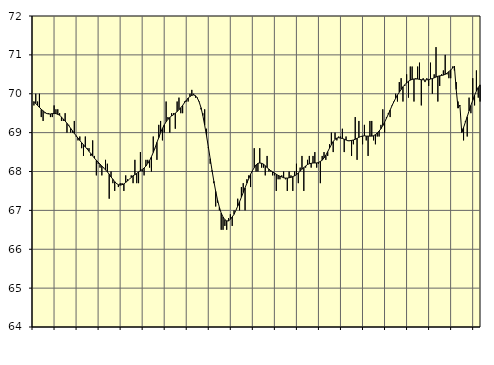
| Category | Piggar | Series 1 |
|---|---|---|
| nan | 69.7 | 69.8 |
| 1.0 | 70 | 69.75 |
| 1.0 | 69.8 | 69.7 |
| 1.0 | 70 | 69.65 |
| 1.0 | 69.4 | 69.6 |
| 1.0 | 69.3 | 69.56 |
| 1.0 | 69.5 | 69.52 |
| 1.0 | 69.5 | 69.49 |
| 1.0 | 69.5 | 69.48 |
| 1.0 | 69.4 | 69.48 |
| 1.0 | 69.4 | 69.49 |
| 1.0 | 69.7 | 69.49 |
| nan | 69.6 | 69.49 |
| 2.0 | 69.6 | 69.47 |
| 2.0 | 69.5 | 69.45 |
| 2.0 | 69.3 | 69.4 |
| 2.0 | 69.3 | 69.35 |
| 2.0 | 69.5 | 69.3 |
| 2.0 | 69 | 69.24 |
| 2.0 | 69.2 | 69.18 |
| 2.0 | 69 | 69.11 |
| 2.0 | 69 | 69.05 |
| 2.0 | 69.3 | 68.98 |
| 2.0 | 68.9 | 68.92 |
| nan | 68.8 | 68.86 |
| 3.0 | 68.9 | 68.8 |
| 3.0 | 68.6 | 68.74 |
| 3.0 | 68.4 | 68.69 |
| 3.0 | 68.9 | 68.63 |
| 3.0 | 68.6 | 68.58 |
| 3.0 | 68.6 | 68.52 |
| 3.0 | 68.4 | 68.46 |
| 3.0 | 68.8 | 68.4 |
| 3.0 | 68.4 | 68.34 |
| 3.0 | 67.9 | 68.29 |
| 3.0 | 68.2 | 68.24 |
| nan | 68.1 | 68.19 |
| 4.0 | 67.9 | 68.14 |
| 4.0 | 68.1 | 68.09 |
| 4.0 | 68.3 | 68.04 |
| 4.0 | 68.2 | 67.99 |
| 4.0 | 67.3 | 67.93 |
| 4.0 | 68 | 67.86 |
| 4.0 | 67.7 | 67.8 |
| 4.0 | 67.5 | 67.74 |
| 4.0 | 67.7 | 67.69 |
| 4.0 | 67.6 | 67.66 |
| 4.0 | 67.7 | 67.65 |
| nan | 67.7 | 67.66 |
| 5.0 | 67.5 | 67.68 |
| 5.0 | 67.9 | 67.72 |
| 5.0 | 67.8 | 67.76 |
| 5.0 | 67.8 | 67.8 |
| 5.0 | 67.9 | 67.85 |
| 5.0 | 67.7 | 67.89 |
| 5.0 | 68.3 | 67.92 |
| 5.0 | 67.7 | 67.95 |
| 5.0 | 67.7 | 67.99 |
| 5.0 | 68.5 | 68.02 |
| 5.0 | 68 | 68.05 |
| nan | 67.9 | 68.09 |
| 6.0 | 68.3 | 68.14 |
| 6.0 | 68.3 | 68.21 |
| 6.0 | 68.1 | 68.28 |
| 6.0 | 68 | 68.38 |
| 6.0 | 68.9 | 68.49 |
| 6.0 | 68.6 | 68.61 |
| 6.0 | 68.3 | 68.75 |
| 6.0 | 69.2 | 68.87 |
| 6.0 | 69.3 | 69 |
| 6.0 | 68.8 | 69.11 |
| 6.0 | 69 | 69.2 |
| nan | 69.8 | 69.28 |
| 7.0 | 69.4 | 69.34 |
| 7.0 | 69 | 69.39 |
| 7.0 | 69.5 | 69.43 |
| 7.0 | 69.5 | 69.46 |
| 7.0 | 69.1 | 69.5 |
| 7.0 | 69.8 | 69.54 |
| 7.0 | 69.9 | 69.59 |
| 7.0 | 69.5 | 69.64 |
| 7.0 | 69.5 | 69.7 |
| 7.0 | 69.8 | 69.77 |
| 7.0 | 69.8 | 69.83 |
| nan | 69.8 | 69.89 |
| 8.0 | 70 | 69.93 |
| 8.0 | 70.1 | 69.96 |
| 8.0 | 70 | 69.97 |
| 8.0 | 69.9 | 69.95 |
| 8.0 | 69.9 | 69.89 |
| 8.0 | 69.8 | 69.79 |
| 8.0 | 69.6 | 69.64 |
| 8.0 | 69.5 | 69.44 |
| 8.0 | 69.6 | 69.19 |
| 8.0 | 69.1 | 68.92 |
| 8.0 | 68.6 | 68.63 |
| nan | 68.2 | 68.33 |
| 9.0 | 68 | 68.03 |
| 9.0 | 67.7 | 67.75 |
| 9.0 | 67.1 | 67.49 |
| 9.0 | 67.2 | 67.27 |
| 9.0 | 67 | 67.08 |
| 9.0 | 66.5 | 66.93 |
| 9.0 | 66.5 | 66.83 |
| 9.0 | 66.6 | 66.76 |
| 9.0 | 66.5 | 66.73 |
| 9.0 | 66.8 | 66.73 |
| 9.0 | 66.9 | 66.77 |
| nan | 66.6 | 66.83 |
| 10.0 | 67 | 66.9 |
| 10.0 | 67 | 67 |
| 10.0 | 67.3 | 67.11 |
| 10.0 | 67 | 67.22 |
| 10.0 | 67.6 | 67.34 |
| 10.0 | 67.7 | 67.46 |
| 10.0 | 67 | 67.58 |
| 10.0 | 67.8 | 67.7 |
| 10.0 | 67.9 | 67.82 |
| 10.0 | 67.6 | 67.93 |
| 10.0 | 68 | 68.02 |
| nan | 68.6 | 68.1 |
| 11.0 | 68 | 68.17 |
| 11.0 | 68 | 68.21 |
| 11.0 | 68.6 | 68.22 |
| 11.0 | 68.1 | 68.21 |
| 11.0 | 68.1 | 68.19 |
| 11.0 | 67.9 | 68.15 |
| 11.0 | 68.4 | 68.1 |
| 11.0 | 68 | 68.06 |
| 11.0 | 68 | 68.02 |
| 11.0 | 67.9 | 67.99 |
| 11.0 | 67.9 | 67.96 |
| nan | 67.5 | 67.93 |
| 12.0 | 67.8 | 67.9 |
| 12.0 | 67.8 | 67.88 |
| 12.0 | 67.9 | 67.86 |
| 12.0 | 68 | 67.84 |
| 12.0 | 67.8 | 67.83 |
| 12.0 | 67.5 | 67.83 |
| 12.0 | 68 | 67.84 |
| 12.0 | 67.9 | 67.85 |
| 12.0 | 67.5 | 67.87 |
| 12.0 | 68 | 67.89 |
| 12.0 | 68.2 | 67.92 |
| nan | 67.7 | 67.96 |
| 13.0 | 68.1 | 68.01 |
| 13.0 | 68.4 | 68.06 |
| 13.0 | 67.5 | 68.1 |
| 13.0 | 68.1 | 68.14 |
| 13.0 | 68.3 | 68.18 |
| 13.0 | 68.4 | 68.2 |
| 13.0 | 68.1 | 68.21 |
| 13.0 | 68.4 | 68.22 |
| 13.0 | 68.5 | 68.22 |
| 13.0 | 68.1 | 68.22 |
| 13.0 | 68.2 | 68.23 |
| nan | 67.7 | 68.26 |
| 14.0 | 68.4 | 68.29 |
| 14.0 | 68.5 | 68.35 |
| 14.0 | 68.3 | 68.42 |
| 14.0 | 68.4 | 68.51 |
| 14.0 | 68.7 | 68.6 |
| 14.0 | 69 | 68.69 |
| 14.0 | 68.5 | 68.77 |
| 14.0 | 69 | 68.83 |
| 14.0 | 68.8 | 68.86 |
| 14.0 | 68.9 | 68.87 |
| 14.0 | 68.9 | 68.86 |
| nan | 69.1 | 68.85 |
| 15.0 | 68.5 | 68.83 |
| 15.0 | 68.9 | 68.81 |
| 15.0 | 68.8 | 68.79 |
| 15.0 | 68.8 | 68.79 |
| 15.0 | 68.4 | 68.8 |
| 15.0 | 68.7 | 68.81 |
| 15.0 | 69.4 | 68.83 |
| 15.0 | 68.3 | 68.85 |
| 15.0 | 69.3 | 68.88 |
| 15.0 | 68.9 | 68.9 |
| 15.0 | 68.7 | 68.91 |
| nan | 69.2 | 68.92 |
| 16.0 | 68.8 | 68.91 |
| 16.0 | 68.4 | 68.91 |
| 16.0 | 69.3 | 68.91 |
| 16.0 | 69.3 | 68.91 |
| 16.0 | 68.8 | 68.92 |
| 16.0 | 68.7 | 68.95 |
| 16.0 | 68.9 | 68.99 |
| 16.0 | 68.9 | 69.04 |
| 16.0 | 69.2 | 69.1 |
| 16.0 | 69.6 | 69.18 |
| 16.0 | 69 | 69.27 |
| nan | 69.4 | 69.37 |
| 17.0 | 69.5 | 69.47 |
| 17.0 | 69.4 | 69.58 |
| 17.0 | 69.7 | 69.69 |
| 17.0 | 69.8 | 69.79 |
| 17.0 | 70 | 69.88 |
| 17.0 | 69.8 | 69.97 |
| 17.0 | 70.3 | 70.04 |
| 17.0 | 70.4 | 70.11 |
| 17.0 | 69.8 | 70.18 |
| 17.0 | 70.2 | 70.23 |
| 17.0 | 70.5 | 70.28 |
| nan | 69.9 | 70.32 |
| 18.0 | 70.7 | 70.35 |
| 18.0 | 70.7 | 70.37 |
| 18.0 | 69.8 | 70.38 |
| 18.0 | 70.4 | 70.38 |
| 18.0 | 70.7 | 70.38 |
| 18.0 | 70.8 | 70.37 |
| 18.0 | 69.7 | 70.36 |
| 18.0 | 70.4 | 70.36 |
| 18.0 | 70.3 | 70.35 |
| 18.0 | 70.4 | 70.36 |
| 18.0 | 70.2 | 70.36 |
| nan | 70.8 | 70.38 |
| 19.0 | 70 | 70.39 |
| 19.0 | 70.5 | 70.41 |
| 19.0 | 71.2 | 70.43 |
| 19.0 | 69.8 | 70.45 |
| 19.0 | 70.2 | 70.46 |
| 19.0 | 70.5 | 70.47 |
| 19.0 | 70.6 | 70.48 |
| 19.0 | 71 | 70.5 |
| 19.0 | 70.5 | 70.53 |
| 19.0 | 70.4 | 70.57 |
| 19.0 | 70.4 | 70.61 |
| nan | 70.7 | 70.66 |
| 20.0 | 70.6 | 70.71 |
| 20.0 | 70.3 | 70.11 |
| 20.0 | 69.8 | 69.63 |
| 20.0 | 69.7 | 69.71 |
| 20.0 | 69 | 69 |
| 20.0 | 68.8 | 69.13 |
| 20.0 | 69.3 | 69.27 |
| 20.0 | 68.9 | 69.41 |
| 20.0 | 69.9 | 69.56 |
| 20.0 | 69.5 | 69.7 |
| 20.0 | 70.4 | 69.83 |
| nan | 69.7 | 69.96 |
| 21.0 | 70.6 | 70.07 |
| 21.0 | 69.9 | 70.16 |
| 21.0 | 69.8 | 70.23 |